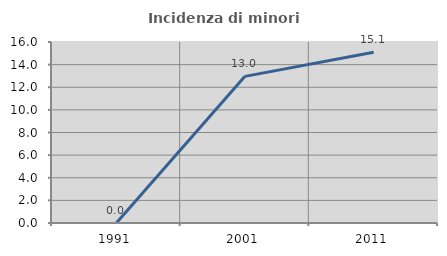
| Category | Incidenza di minori stranieri |
|---|---|
| 1991.0 | 0 |
| 2001.0 | 12.963 |
| 2011.0 | 15.094 |